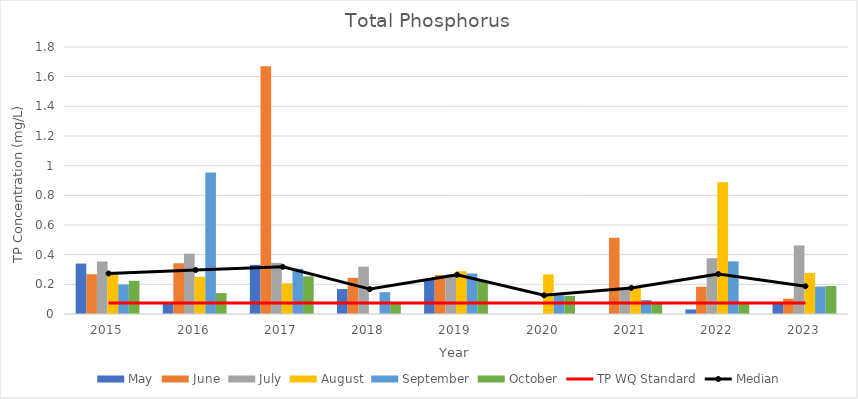
| Category | May | June | July | August | September | October |
|---|---|---|---|---|---|---|
| 2015.0 | 0.34 | 0.268 | 0.354 | 0.278 | 0.199 | 0.224 |
| 2016.0 | 0.071 | 0.342 | 0.407 | 0.251 | 0.954 | 0.141 |
| 2017.0 | 0.331 | 1.67 | 0.345 | 0.207 | 0.305 | 0.254 |
| 2018.0 | 0.168 | 0.244 | 0.319 | 0 | 0.147 | 0.069 |
| 2019.0 | 0.23 | 0.262 | 0.267 | 0.288 | 0.273 | 0.224 |
| 2020.0 | 0 | 0 | 0 | 0.267 | 0.126 | 0.122 |
| 2021.0 | 0 | 0.514 | 0.176 | 0.186 | 0.094 | 0.067 |
| 2022.0 | 0.031 | 0.184 | 0.376 | 0.888 | 0.355 | 0.076 |
| 2023.0 | 0.072 | 0.103 | 0.462 | 0.277 | 0.185 | 0.189 |